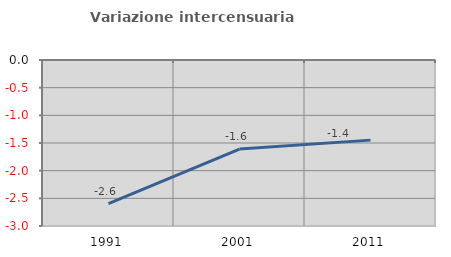
| Category | Variazione intercensuaria annua |
|---|---|
| 1991.0 | -2.597 |
| 2001.0 | -1.611 |
| 2011.0 | -1.448 |